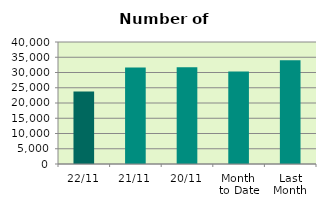
| Category | Series 0 |
|---|---|
| 22/11 | 23764 |
| 21/11 | 31666 |
| 20/11 | 31692 |
| Month 
to Date | 30297.375 |
| Last
Month | 34034.348 |